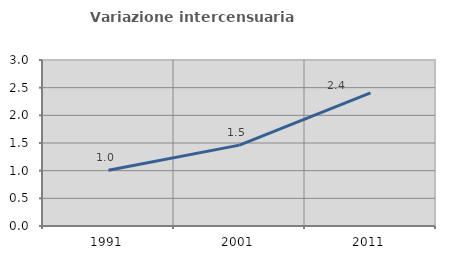
| Category | Variazione intercensuaria annua |
|---|---|
| 1991.0 | 1.006 |
| 2001.0 | 1.461 |
| 2011.0 | 2.404 |